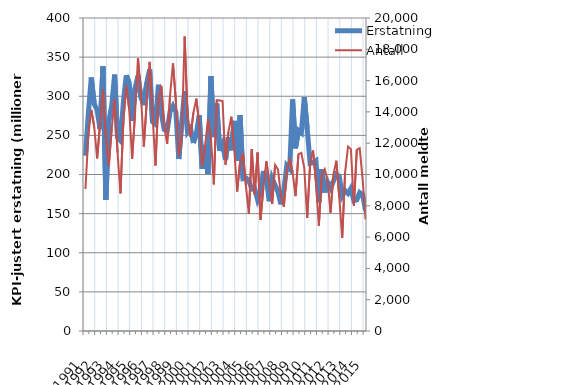
| Category | Erstatning |
|---|---|
| 1991.0 | 224.004 |
| nan | 278.701 |
| nan | 323.912 |
| nan | 290.109 |
| 1992.0 | 282.405 |
| nan | 258.04 |
| nan | 338.16 |
| nan | 167.714 |
| 1993.0 | 267.55 |
| nan | 288.274 |
| nan | 327.744 |
| nan | 247.473 |
| 1994.0 | 243.261 |
| nan | 292.909 |
| nan | 326.717 |
| nan | 316.969 |
| 1995.0 | 268.377 |
| nan | 310.462 |
| nan | 326.029 |
| nan | 298.546 |
| 1996.0 | 288.624 |
| nan | 316.842 |
| nan | 334.294 |
| nan | 267.261 |
| 1997.0 | 264.232 |
| nan | 314.716 |
| nan | 278.564 |
| nan | 257.522 |
| 1998.0 | 255.602 |
| nan | 280.391 |
| nan | 287.517 |
| nan | 279.782 |
| 1999.0 | 219.796 |
| nan | 266.7 |
| nan | 306.511 |
| nan | 254.224 |
| 2000.0 | 259.141 |
| nan | 240.324 |
| nan | 252.088 |
| nan | 275.595 |
| 2001.0 | 207.244 |
| nan | 237.701 |
| nan | 200.728 |
| nan | 325.563 |
| 2002.0 | 247.873 |
| nan | 290.601 |
| nan | 230.457 |
| nan | 239.267 |
| 2003.0 | 218.61 |
| nan | 247.712 |
| nan | 230.981 |
| nan | 268.572 |
| 2004.0 | 217.508 |
| nan | 275.732 |
| nan | 194.81 |
| nan | 195.623 |
| 2005.0 | 192.286 |
| nan | 181.226 |
| nan | 181.978 |
| nan | 167.584 |
| 2006.0 | 176.819 |
| nan | 204.479 |
| nan | 195.021 |
| nan | 165.776 |
| 2007.0 | 195.039 |
| nan | 186.314 |
| nan | 177.691 |
| nan | 161.832 |
| 2008.0 | 179.801 |
| nan | 211.41 |
| nan | 207.185 |
| nan | 295.976 |
| 2009.0 | 233.497 |
| nan | 256.265 |
| nan | 253.058 |
| nan | 298.888 |
| 2010.0 | 258.589 |
| nan | 214.112 |
| nan | 214.991 |
| nan | 217.554 |
| 2011.0 | 164.553 |
| nan | 206.709 |
| nan | 176.997 |
| nan | 189.985 |
| 2012.0 | 182.676 |
| nan | 191.481 |
| nan | 200.115 |
| nan | 197.486 |
| 2013.0 | 172.77 |
| nan | 179.578 |
| nan | 175.887 |
| nan | 182.23 |
| 2014.0 | 166.5 |
| nan | 167.566 |
| nan | 176.903 |
| nan | 174.149 |
| 2015.0 | 153.686 |